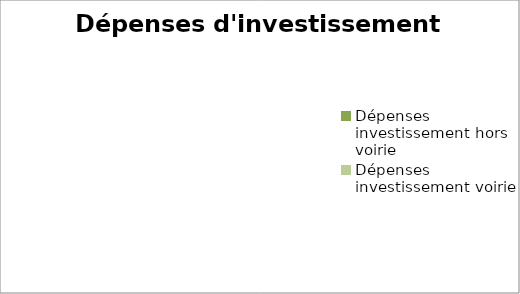
| Category | Series 0 |
|---|---|
| Dépenses investissement hors voirie  | 0 |
| Dépenses investissement voirie  | 0 |